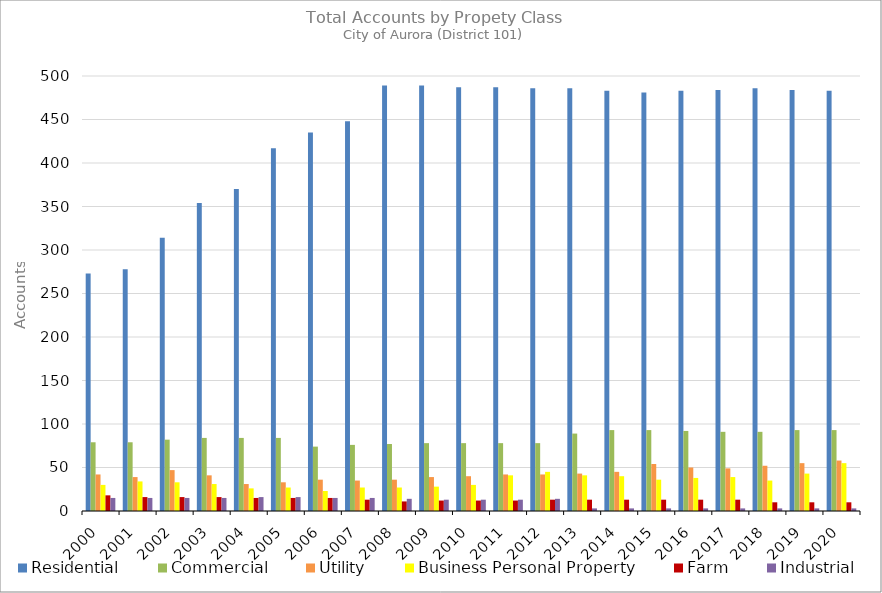
| Category | Residential | Commercial | Utility | Business Personal Property | Farm | Industrial |
|---|---|---|---|---|---|---|
| 2000.0 | 273 | 79 | 42 | 30 | 18 | 15 |
| 2001.0 | 278 | 79 | 39 | 34 | 16 | 15 |
| 2002.0 | 314 | 82 | 47 | 33 | 16 | 15 |
| 2003.0 | 354 | 84 | 41 | 31 | 16 | 15 |
| 2004.0 | 370 | 84 | 31 | 26 | 15 | 16 |
| 2005.0 | 417 | 84 | 33 | 27 | 15 | 16 |
| 2006.0 | 435 | 74 | 36 | 23 | 15 | 15 |
| 2007.0 | 448 | 76 | 35 | 27 | 13 | 15 |
| 2008.0 | 489 | 77 | 36 | 27 | 11 | 14 |
| 2009.0 | 489 | 78 | 39 | 28 | 12 | 13 |
| 2010.0 | 487 | 78 | 40 | 30 | 12 | 13 |
| 2011.0 | 487 | 78 | 42 | 41 | 12 | 13 |
| 2012.0 | 486 | 78 | 42 | 45 | 13 | 14 |
| 2013.0 | 486 | 89 | 43 | 41 | 13 | 3 |
| 2014.0 | 483 | 93 | 45 | 40 | 13 | 3 |
| 2015.0 | 481 | 93 | 54 | 36 | 13 | 3 |
| 2016.0 | 483 | 92 | 50 | 38 | 13 | 3 |
| 2017.0 | 484 | 91 | 49 | 39 | 13 | 3 |
| 2018.0 | 486 | 91 | 52 | 35 | 10 | 3 |
| 2019.0 | 484 | 93 | 55 | 43 | 10 | 3 |
| 2020.0 | 483 | 93 | 58 | 55 | 10 | 3 |